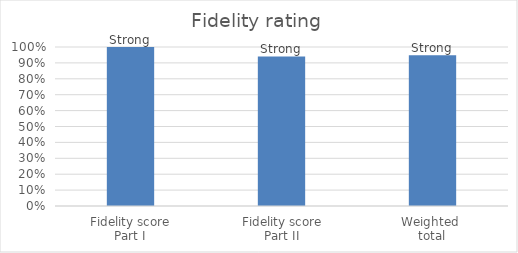
| Category | Series 0 |
|---|---|
| Fidelity score
Part I | 1 |
| Fidelity score
Part II | 0.94 |
| Weighted 
total | 0.948 |